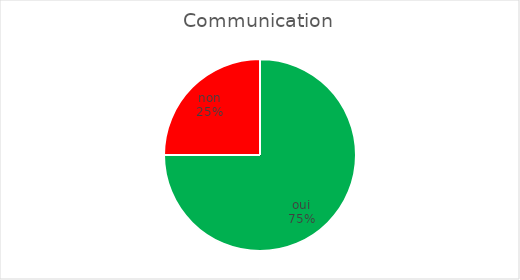
| Category | Communication  |
|---|---|
| oui | 6 |
| non | 2 |